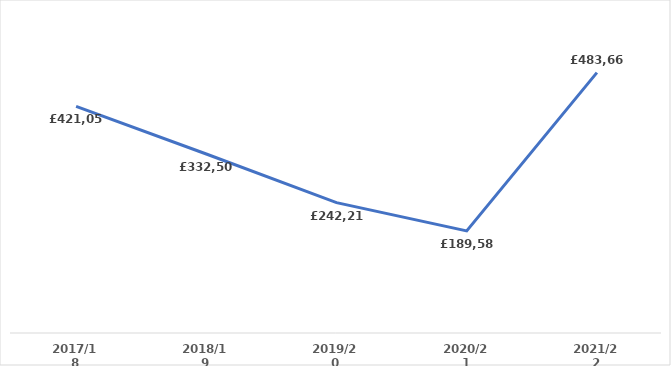
| Category | Series 0 |
|---|---|
| 2017/18 | 421050.48 |
| 2018/19 | 332502 |
| 2019/20 | 242218.273 |
| 2020/21 | 189580.028 |
| 2021/22 | 483668.923 |